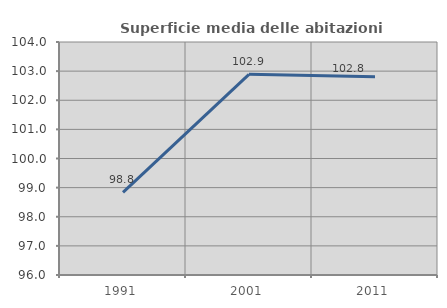
| Category | Superficie media delle abitazioni occupate |
|---|---|
| 1991.0 | 98.839 |
| 2001.0 | 102.889 |
| 2011.0 | 102.808 |